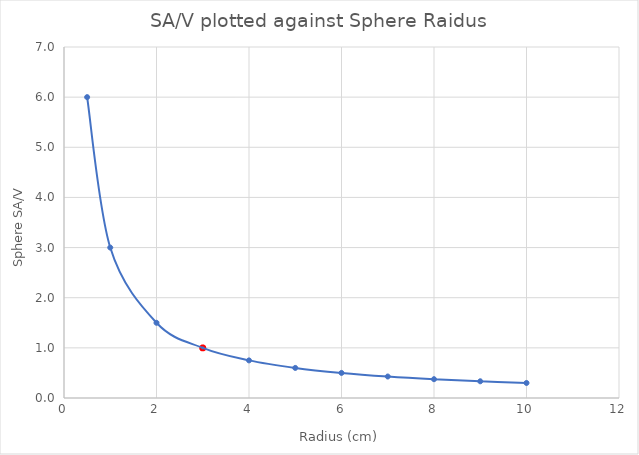
| Category | Series 0 |
|---|---|
| 0.5 | 6 |
| 1.0 | 3 |
| 2.0 | 1.5 |
| 3.0 | 1 |
| 4.0 | 0.75 |
| 5.0 | 0.6 |
| 6.0 | 0.5 |
| 7.0 | 0.429 |
| 8.0 | 0.375 |
| 9.0 | 0.333 |
| 10.0 | 0.3 |